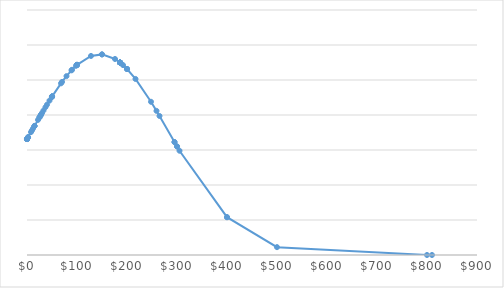
| Category | Series 0 |
|---|---|
| 0.0 | 0.002 |
| 0.0 | 0.002 |
| 0.0 | 0.002 |
| 0.0 | 0.002 |
| 0.0 | 0.002 |
| 0.0 | 0.002 |
| 2.0 | 0.002 |
| 2.0 | 0.002 |
| 2.0 | 0.002 |
| 8.0 | 0.002 |
| 10.0 | 0.002 |
| 12.0 | 0.002 |
| 15.0 | 0.002 |
| 15.0 | 0.002 |
| 15.0 | 0.002 |
| 22.0 | 0.002 |
| 25.0 | 0.002 |
| 25.0 | 0.002 |
| 27.0 | 0.002 |
| 28.0 | 0.002 |
| 28.0 | 0.002 |
| 30.0 | 0.002 |
| 33.0 | 0.002 |
| 37.0 | 0.002 |
| 40.0 | 0.002 |
| 45.0 | 0.002 |
| 50.0 | 0.002 |
| 50.0 | 0.002 |
| 50.0 | 0.002 |
| 50.0 | 0.002 |
| 50.0 | 0.002 |
| 50.0 | 0.002 |
| 50.0 | 0.002 |
| 50.0 | 0.002 |
| 68.0 | 0.002 |
| 70.0 | 0.002 |
| 79.0 | 0.003 |
| 89.0 | 0.003 |
| 90.0 | 0.003 |
| 98.0 | 0.003 |
| 100.0 | 0.003 |
| 100.0 | 0.003 |
| 100.0 | 0.003 |
| 100.0 | 0.003 |
| 100.0 | 0.003 |
| 100.0 | 0.003 |
| 128.0 | 0.003 |
| 150.0 | 0.003 |
| 150.0 | 0.003 |
| 176.0 | 0.003 |
| 186.0 | 0.003 |
| 186.0 | 0.003 |
| 186.0 | 0.003 |
| 186.0 | 0.003 |
| 186.0 | 0.003 |
| 186.0 | 0.003 |
| 186.0 | 0.003 |
| 186.0 | 0.003 |
| 186.0 | 0.003 |
| 186.0 | 0.003 |
| 186.0 | 0.003 |
| 186.0 | 0.003 |
| 186.0 | 0.003 |
| 186.0 | 0.003 |
| 186.0 | 0.003 |
| 186.0 | 0.003 |
| 186.0 | 0.003 |
| 186.0 | 0.003 |
| 186.0 | 0.003 |
| 186.0 | 0.003 |
| 186.0 | 0.003 |
| 186.0 | 0.003 |
| 186.0 | 0.003 |
| 186.0 | 0.003 |
| 186.0 | 0.003 |
| 186.0 | 0.003 |
| 186.0 | 0.003 |
| 186.0 | 0.003 |
| 186.0 | 0.003 |
| 187.0 | 0.003 |
| 192.0 | 0.003 |
| 200.0 | 0.003 |
| 200.0 | 0.003 |
| 200.0 | 0.003 |
| 217.0 | 0.003 |
| 248.0 | 0.002 |
| 259.0 | 0.002 |
| 265.0 | 0.002 |
| 295.0 | 0.002 |
| 295.0 | 0.002 |
| 300.0 | 0.002 |
| 300.0 | 0.002 |
| 305.0 | 0.001 |
| 400.0 | 0.001 |
| 400.0 | 0.001 |
| 500.0 | 0 |
| 800.0 | 0 |
| 810.0 | 0 |